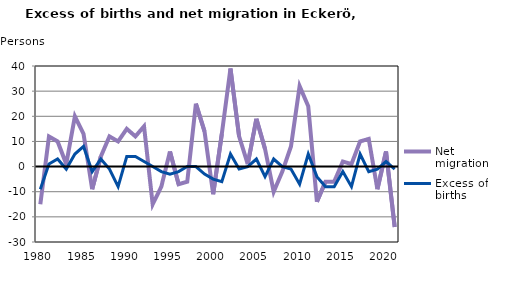
| Category | Net migration | Excess of births |
|---|---|---|
| 1980.0 | -15 | -9 |
| 1981.0 | 12 | 1 |
| 1982.0 | 10 | 3 |
| 1983.0 | 1 | -1 |
| 1984.0 | 20 | 5 |
| 1985.0 | 13 | 8 |
| 1986.0 | -9 | -2 |
| 1987.0 | 4 | 3 |
| 1988.0 | 12 | -1 |
| 1989.0 | 10 | -8 |
| 1990.0 | 15 | 4 |
| 1991.0 | 12 | 4 |
| 1992.0 | 16 | 2 |
| 1993.0 | -15 | 0 |
| 1994.0 | -8 | -2 |
| 1995.0 | 6 | -3 |
| 1996.0 | -7 | -2 |
| 1997.0 | -6 | 0 |
| 1998.0 | 25 | 0 |
| 1999.0 | 14 | -3 |
| 2000.0 | -11 | -5 |
| 2001.0 | 13 | -6 |
| 2002.0 | 39 | 5 |
| 2003.0 | 12 | -1 |
| 2004.0 | 1 | 0 |
| 2005.0 | 19 | 3 |
| 2006.0 | 7 | -4 |
| 2007.0 | -10 | 3 |
| 2008.0 | -2 | 0 |
| 2009.0 | 8 | -1 |
| 2010.0 | 32 | -7 |
| 2011.0 | 24 | 5 |
| 2012.0 | -14 | -4 |
| 2013.0 | -6 | -8 |
| 2014.0 | -6 | -8 |
| 2015.0 | 2 | -2 |
| 2016.0 | 1 | -8 |
| 2017.0 | 10 | 5 |
| 2018.0 | 11 | -2 |
| 2019.0 | -9 | -1 |
| 2020.0 | 6 | 2 |
| 2021.0 | -24 | -1 |